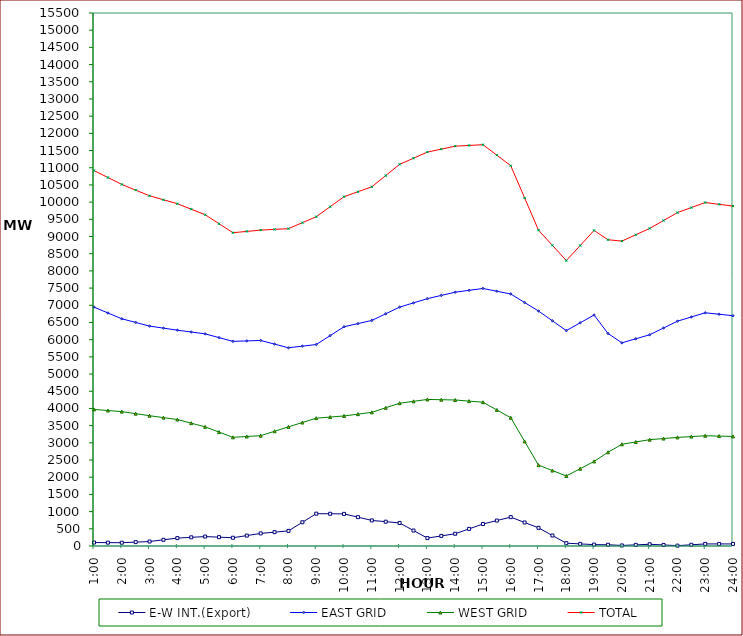
| Category | E-W INT.(Export) | EAST GRID | WEST GRID | TOTAL |
|---|---|---|---|---|
| 1:00 | 100 | 6947 | 3971 | 10918 |
| 1:30 | 98 | 6777 | 3939.5 | 10716.5 |
| 2:00 | 96 | 6607 | 3908 | 10515 |
| 2:30 | 113 | 6501 | 3848.5 | 10349.5 |
| 3:00 | 130 | 6395 | 3789 | 10184 |
| 3:30 | 180 | 6335.5 | 3733.5 | 10069 |
| 4:00 | 230 | 6276 | 3678 | 9954 |
| 4:30 | 252 | 6222.5 | 3571.5 | 9794 |
| 5:00 | 274 | 6169 | 3465 | 9634 |
| 5:30 | 257 | 6060 | 3312.5 | 9372.5 |
| 6:00 | 240 | 5951 | 3160 | 9111 |
| 6:30 | 303 | 5964 | 3184.5 | 9148.5 |
| 7:00 | 366 | 5977 | 3209 | 9186 |
| 7:30 | 403 | 5870.5 | 3337 | 9207.5 |
| 8:00 | 440 | 5764 | 3465 | 9229 |
| 8:30 | 690 | 5811.5 | 3591 | 9402.5 |
| 9:00 | 940 | 5859 | 3717 | 9576 |
| 9:30 | 937 | 6117.5 | 3749.5 | 9867 |
| 10:00 | 934 | 6376 | 3782 | 10158 |
| 10:30 | 839 | 6467.5 | 3834.5 | 10302 |
| 11:00 | 744 | 6559 | 3887 | 10446 |
| 11:30 | 707 | 6753 | 4019.5 | 10772.5 |
| 12:00 | 670 | 6947 | 4152 | 11099 |
| 12:30 | 450 | 7070 | 4207 | 11277 |
| 13:00 | 230 | 7193 | 4262 | 11455 |
| 13:30 | 293 | 7287 | 4254 | 11541 |
| 14:00 | 356 | 7381 | 4246 | 11627 |
| 14:30 | 498 | 7435 | 4213.5 | 11648.5 |
| 15:00 | 640 | 7489 | 4181 | 11670 |
| 15:30 | 740 | 7408.5 | 3956 | 11364.5 |
| 16:00 | 840 | 7328 | 3731 | 11059 |
| 16:30 | 684 | 7080.5 | 3041 | 10121.5 |
| 17:00 | 528 | 6833 | 2351 | 9184 |
| 17:30 | 305 | 6548.5 | 2194 | 8742.5 |
| 18:00 | 82 | 6264 | 2037 | 8301 |
| 18:30 | 61 | 6490.5 | 2248 | 8738.5 |
| 19:00 | 40 | 6717 | 2459 | 9176 |
| 19:30 | 36 | 6181 | 2725 | 8906 |
| 20:00 | 16 | 5908 | 2958 | 8866 |
| 20:30 | 33 | 6025.5 | 3025 | 9050.5 |
| 21:00 | 50 | 6143 | 3092 | 9235 |
| 21:30 | 30 | 6340 | 3125 | 9465 |
| 22:00 | 10 | 6537 | 3158 | 9695 |
| 22:30 | 35 | 6659.5 | 3182 | 9841.5 |
| 23:00 | 60 | 6782 | 3206 | 9988 |
| 23:30 | 60 | 6739.5 | 3196.5 | 9936 |
| 24:00 | 60 | 6697 | 3187 | 9884 |